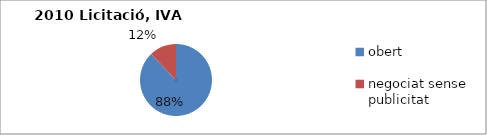
| Category | Licitació, IVA exclòs |
|---|---|
| obert | 14879124.34 |
| negociat sense publicitat  | 2070228.9 |